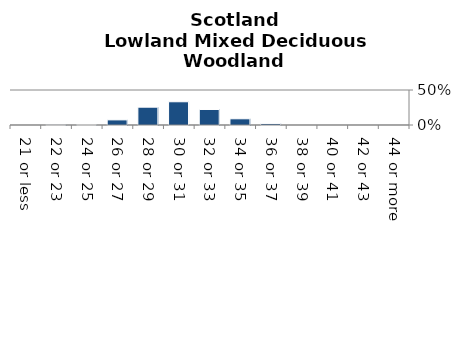
| Category | Lowland Mixed Deciduous Woodland |
|---|---|
| 21 or less | 0 |
| 22 or 23 | 0.003 |
| 24 or 25 | 0.007 |
| 26 or 27 | 0.073 |
| 28 or 29 | 0.254 |
| 30 or 31 | 0.332 |
| 32 or 33 | 0.222 |
| 34 or 35 | 0.089 |
| 36 or 37 | 0.02 |
| 38 or 39 | 0 |
| 40 or 41 | 0 |
| 42 or 43 | 0 |
| 44 or more | 0 |